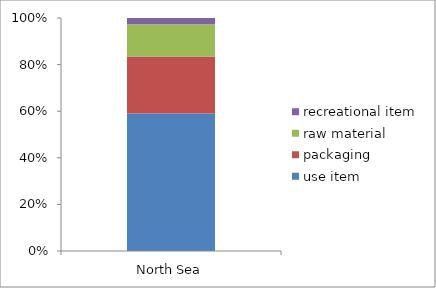
| Category | use item | packaging | raw material | recreational item |
|---|---|---|---|---|
| North Sea | 52050 | 21636 | 12168 | 2393 |